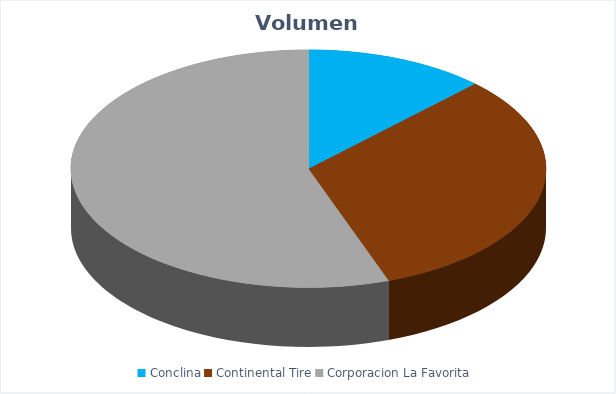
| Category | VOLUMEN ($USD) |
|---|---|
| Conclina | 4668 |
| Continental Tire | 12167 |
| Corporacion La Favorita | 20972.49 |